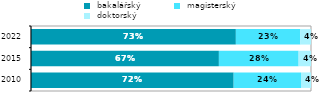
| Category |  bakalářský |  magisterský |  doktorský |
|---|---|---|---|
| 2010.0 | 0.724 | 0.241 | 0.036 |
| 2015.0 | 0.671 | 0.285 | 0.044 |
| 2022.0 | 0.732 | 0.23 | 0.038 |